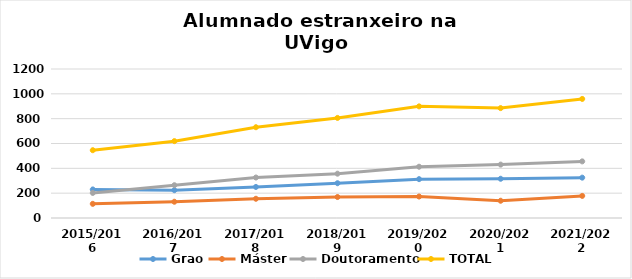
| Category | Grao | Máster | Doutoramento | TOTAL |
|---|---|---|---|---|
| 2015/2016 | 230 | 114 | 202 | 546 |
| 2016/2017 | 224 | 131 | 264 | 619 |
| 2017/2018 | 250 | 155 | 326 | 731 |
| 2018/2019 | 280 | 169 | 357 | 806 |
| 2019/2020 | 313 | 173 | 413 | 899 |
| 2020/2021 | 316 | 139 | 430 | 885 |
| 2021/2022 | 325 | 178 | 456 | 959 |